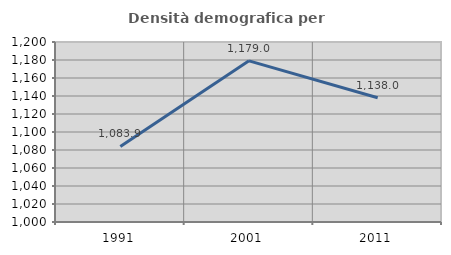
| Category | Densità demografica |
|---|---|
| 1991.0 | 1083.925 |
| 2001.0 | 1179.049 |
| 2011.0 | 1138.048 |